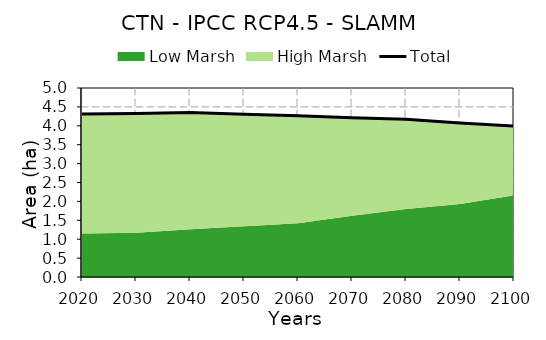
| Category | Total |
|---|---|
| 0 | 4.314 |
| 1 | 4.326 |
| 2 | 4.352 |
| 3 | 4.303 |
| 4 | 4.267 |
| 5 | 4.213 |
| 6 | 4.171 |
| 7 | 4.073 |
| 8 | 3.991 |